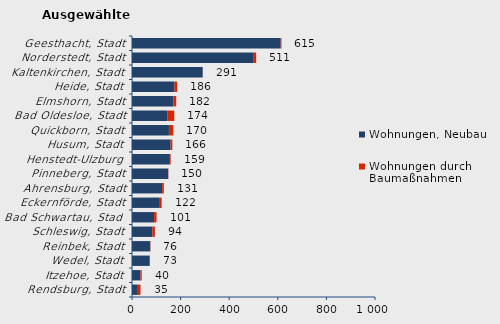
| Category | Wohnungen, Neubau | Wohnungen durch Baumaßnahmen | Series 2 |
|---|---|---|---|
| Rendsburg, Stadt | 24 | 11 | 35 |
| Itzehoe, Stadt | 35 | 5 | 40 |
| Wedel, Stadt | 73 | 0 | 73 |
| Reinbek, Stadt | 75 | 1 | 76 |
| Schleswig, Stadt | 84 | 10 | 94 |
| Bad Schwartau, Stadt | 91 | 10 | 101 |
| Eckernförde, Stadt | 111 | 11 | 122 |
| Ahrensburg, Stadt | 124 | 7 | 131 |
| Pinneberg, Stadt | 149 | 1 | 150 |
| Henstedt-Ulzburg | 156 | 3 | 159 |
| Husum, Stadt | 159 | 7 | 166 |
| Quickborn, Stadt | 152 | 18 | 170 |
| Bad Oldesloe, Stadt | 145 | 29 | 174 |
| Elmshorn, Stadt | 170 | 12 | 182 |
| Heide, Stadt | 175 | 11 | 186 |
| Kaltenkirchen, Stadt | 291 | 0 | 291 |
| Norderstedt, Stadt | 501 | 10 | 511 |
| Geesthacht, Stadt | 612 | 3 | 615 |